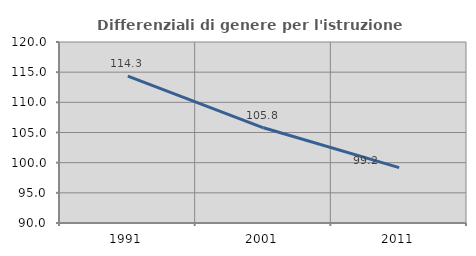
| Category | Differenziali di genere per l'istruzione superiore |
|---|---|
| 1991.0 | 114.335 |
| 2001.0 | 105.78 |
| 2011.0 | 99.179 |